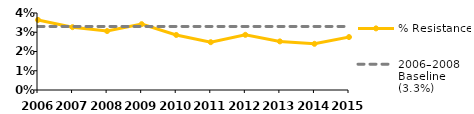
| Category | % Resistance | 2006–2008 Baseline (3.3%) |
|---|---|---|
| 2006.0 | 0.036 | 0.033 |
| 2007.0 | 0.033 | 0.033 |
| 2008.0 | 0.031 | 0.033 |
| 2009.0 | 0.034 | 0.033 |
| 2010.0 | 0.029 | 0.033 |
| 2011.0 | 0.025 | 0.033 |
| 2012.0 | 0.029 | 0.033 |
| 2013.0 | 0.025 | 0.033 |
| 2014.0 | 0.024 | 0.033 |
| 2015.0 | 0.027 | 0.033 |